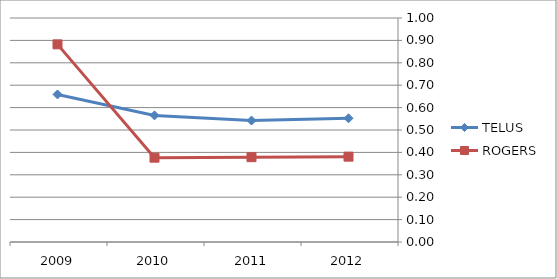
| Category | TELUS | ROGERS |
|---|---|---|
| 2012.0 | 0.552 | 0.381 |
| 2011.0 | 0.542 | 0.379 |
| 2010.0 | 0.565 | 0.376 |
| 2009.0 | 0.659 | 0.882 |